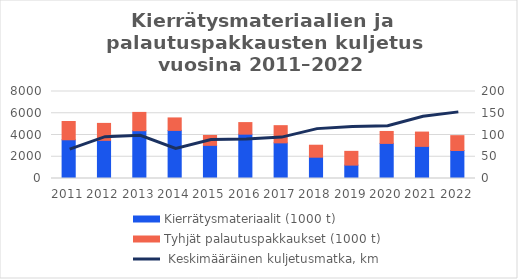
| Category | Kierrätysmateriaalit (1000 t) | Tyhjät palautuspakkaukset (1000 t) |
|---|---|---|
| 2011.0 | 3561 | 1682 |
| 2012.0 | 3508 | 1559 |
| 2013.0 | 4395 | 1682 |
| 2014.0 | 4422 | 1148 |
| 2015.0 | 3049 | 908 |
| 2016.0 | 4077 | 1064 |
| 2017.0 | 3278 | 1581 |
| 2018.0 | 1959 | 1101 |
| 2019.0 | 1231 | 1265 |
| 2020.0 | 3226 | 1100 |
| 2021.0 | 2954 | 1315 |
| 2022.0 | 2577 | 1362 |